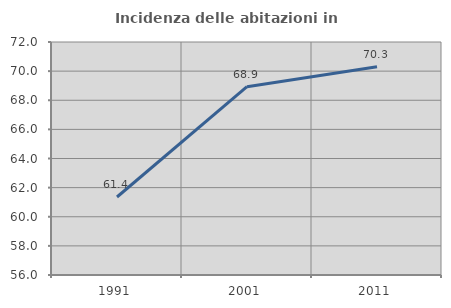
| Category | Incidenza delle abitazioni in proprietà  |
|---|---|
| 1991.0 | 61.357 |
| 2001.0 | 68.931 |
| 2011.0 | 70.301 |